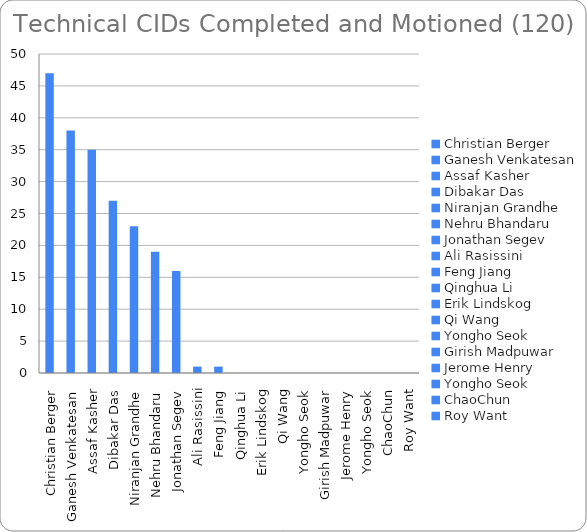
| Category | Series 0 |
|---|---|
| Christian Berger | 47 |
| Ganesh Venkatesan | 38 |
| Assaf Kasher | 35 |
| Dibakar Das | 27 |
| Niranjan Grandhe | 23 |
| Nehru Bhandaru | 19 |
| Jonathan Segev | 16 |
| Ali Rasissini | 1 |
| Feng Jiang | 1 |
| Qinghua Li | 0 |
| Erik Lindskog | 0 |
| Qi Wang | 0 |
| Yongho Seok | 0 |
| Girish Madpuwar | 0 |
| Jerome Henry | 0 |
| Yongho Seok | 0 |
| ChaoChun | 0 |
| Roy Want | 0 |